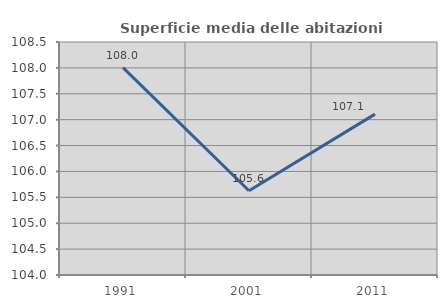
| Category | Superficie media delle abitazioni occupate |
|---|---|
| 1991.0 | 108.004 |
| 2001.0 | 105.628 |
| 2011.0 | 107.107 |